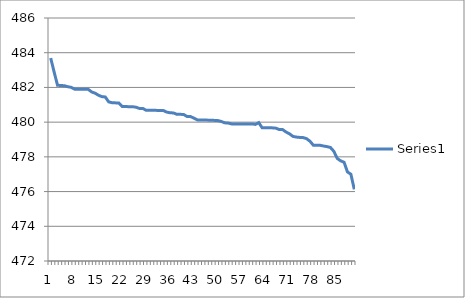
| Category | Series 0 |
|---|---|
| 0 | 483.69 |
| 1 | 482.89 |
| 2 | 482.126 |
| 3 | 482.11 |
| 4 | 482.1 |
| 5 | 482.04 |
| 6 | 482.006 |
| 7 | 481.9 |
| 8 | 481.9 |
| 9 | 481.9 |
| 10 | 481.9 |
| 11 | 481.89 |
| 12 | 481.74 |
| 13 | 481.67 |
| 14 | 481.55 |
| 15 | 481.47 |
| 16 | 481.45 |
| 17 | 481.167 |
| 18 | 481.12 |
| 19 | 481.11 |
| 20 | 481.1 |
| 21 | 480.9 |
| 22 | 480.898 |
| 23 | 480.89 |
| 24 | 480.89 |
| 25 | 480.86 |
| 26 | 480.79 |
| 27 | 480.79 |
| 28 | 480.68 |
| 29 | 480.68 |
| 30 | 480.68 |
| 31 | 480.678 |
| 32 | 480.67 |
| 33 | 480.67 |
| 34 | 480.58 |
| 35 | 480.54 |
| 36 | 480.53 |
| 37 | 480.45 |
| 38 | 480.45 |
| 39 | 480.44 |
| 40 | 480.32 |
| 41 | 480.32 |
| 42 | 480.23 |
| 43 | 480.13 |
| 44 | 480.12 |
| 45 | 480.12 |
| 46 | 480.116 |
| 47 | 480.116 |
| 48 | 480.1 |
| 49 | 480.09 |
| 50 | 480.04 |
| 51 | 479.96 |
| 52 | 479.95 |
| 53 | 479.9 |
| 54 | 479.9 |
| 55 | 479.9 |
| 56 | 479.9 |
| 57 | 479.899 |
| 58 | 479.899 |
| 59 | 479.899 |
| 60 | 479.87 |
| 61 | 479.97 |
| 62 | 479.67 |
| 63 | 479.67 |
| 64 | 479.67 |
| 65 | 479.67 |
| 66 | 479.654 |
| 67 | 479.574 |
| 68 | 479.57 |
| 69 | 479.43 |
| 70 | 479.33 |
| 71 | 479.18 |
| 72 | 479.14 |
| 73 | 479.12 |
| 74 | 479.11 |
| 75 | 479.05 |
| 76 | 478.9 |
| 77 | 478.67 |
| 78 | 478.67 |
| 79 | 478.665 |
| 80 | 478.624 |
| 81 | 478.59 |
| 82 | 478.541 |
| 83 | 478.32 |
| 84 | 477.91 |
| 85 | 477.77 |
| 86 | 477.69 |
| 87 | 477.13 |
| 88 | 477 |
| 89 | 476.128 |